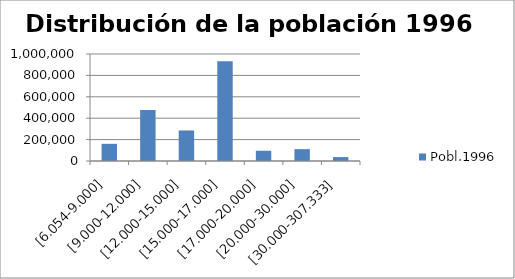
| Category | Pobl.1996 |
|---|---|
| [6.054-9.000] | 160674 |
| [9.000-12.000] | 476202 |
| [12.000-15.000] | 285422 |
| [15.000-17.000] | 932822 |
| [17.000-20.000] | 95812 |
| [20.000-30.000] | 110720 |
| [30.000-307.333] | 36403 |